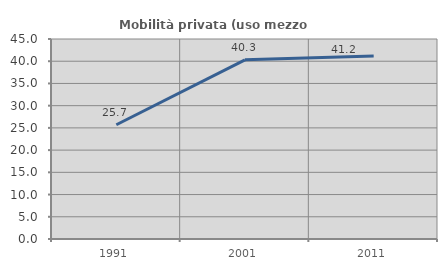
| Category | Mobilità privata (uso mezzo privato) |
|---|---|
| 1991.0 | 25.714 |
| 2001.0 | 40.317 |
| 2011.0 | 41.158 |